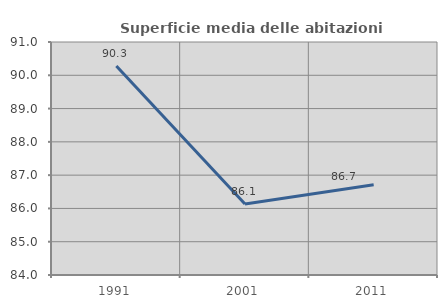
| Category | Superficie media delle abitazioni occupate |
|---|---|
| 1991.0 | 90.279 |
| 2001.0 | 86.133 |
| 2011.0 | 86.713 |